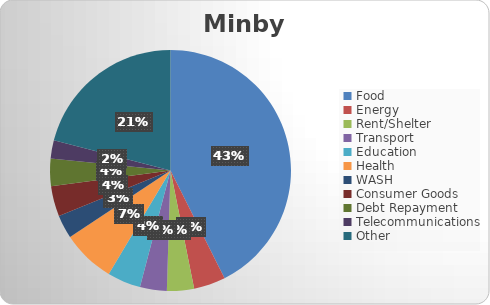
| Category | Series 0 |
|---|---|
| Food  | 163038.168 |
| Energy | 16290.076 |
| Rent/Shelter | 13900.763 |
| Transport | 13770.992 |
| Education | 17160.305 |
| Health | 27267.176 |
| WASH | 12110.687 |
| Consumer Goods | 15480.916 |
| Debt Repayment | 14137.405 |
| Telecommunications | 9351.145 |
| Other  | 80244.275 |